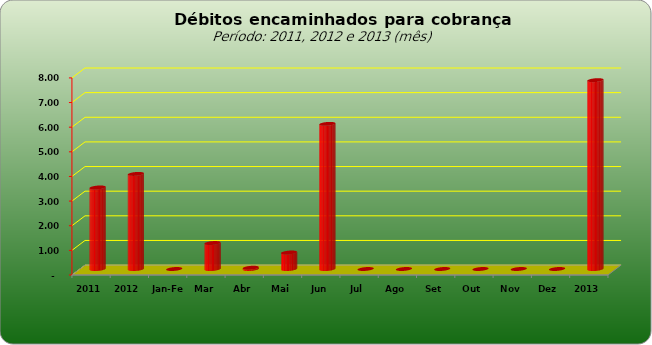
| Category |  3.309.443,02   3.859.728,44   -     1.053.903,71   50.529,60   669.296,13   5.890.806,29   -     -     -     -     -     -     7.664.535,73  |
|---|---|
| 2011 | 3309443.02 |
| 2012 | 3859728.44 |
| Jan-Fev | 0 |
| Mar | 1053903.71 |
| Abr | 50529.6 |
| Mai | 669296.13 |
| Jun | 5890806.29 |
| Jul | 0 |
| Ago | 0 |
| Set | 0 |
| Out | 0 |
| Nov | 0 |
| Dez | 0 |
| 2013 | 7664535.73 |